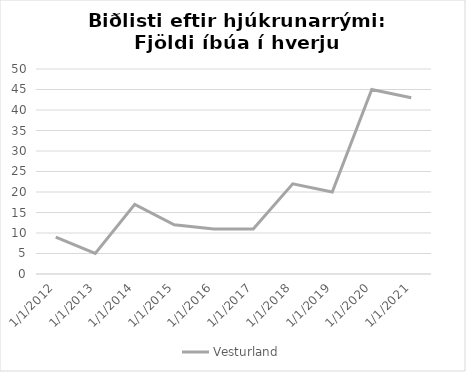
| Category | Vesturland |
|---|---|
| 1/1/12 | 9 |
| 1/1/13 | 5 |
| 1/1/14 | 17 |
| 1/1/15 | 12 |
| 1/1/16 | 11 |
| 1/1/17 | 11 |
| 1/1/18 | 22 |
| 1/1/19 | 20 |
| 1/1/20 | 45 |
| 1/1/21 | 43 |